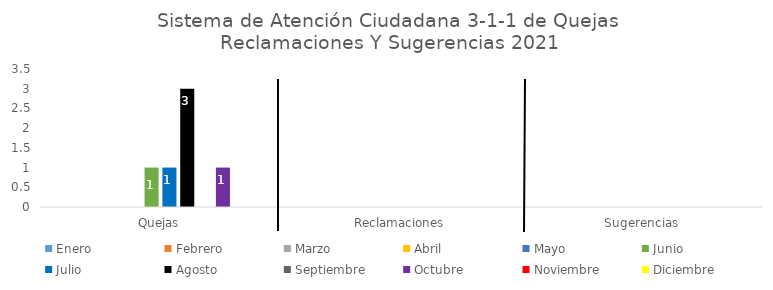
| Category | Enero | Febrero | Marzo | Abril | Mayo | Junio | Julio | Agosto | Septiembre | Octubre | Noviembre | Diciembre |
|---|---|---|---|---|---|---|---|---|---|---|---|---|
| Quejas | 0 | 0 | 0 | 0 | 0 | 1 | 1 | 3 | 0 | 1 | 0 | 0 |
| Reclamaciones | 0 | 0 | 0 | 0 | 0 | 0 | 0 | 0 | 0 | 0 | 0 | 0 |
| Sugerencias | 0 | 0 | 0 | 0 | 0 | 0 | 0 | 0 | 0 | 0 | 0 | 0 |